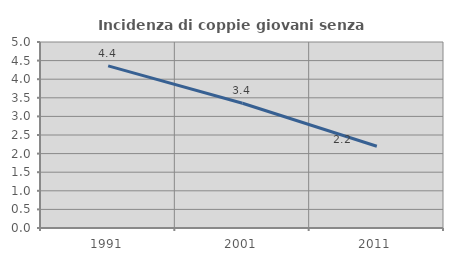
| Category | Incidenza di coppie giovani senza figli |
|---|---|
| 1991.0 | 4.358 |
| 2001.0 | 3.353 |
| 2011.0 | 2.199 |